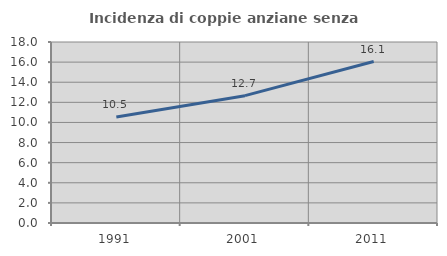
| Category | Incidenza di coppie anziane senza figli  |
|---|---|
| 1991.0 | 10.548 |
| 2001.0 | 12.664 |
| 2011.0 | 16.06 |